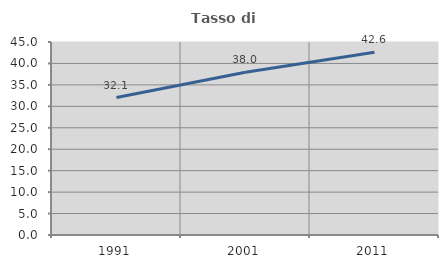
| Category | Tasso di occupazione   |
|---|---|
| 1991.0 | 32.059 |
| 2001.0 | 37.952 |
| 2011.0 | 42.623 |